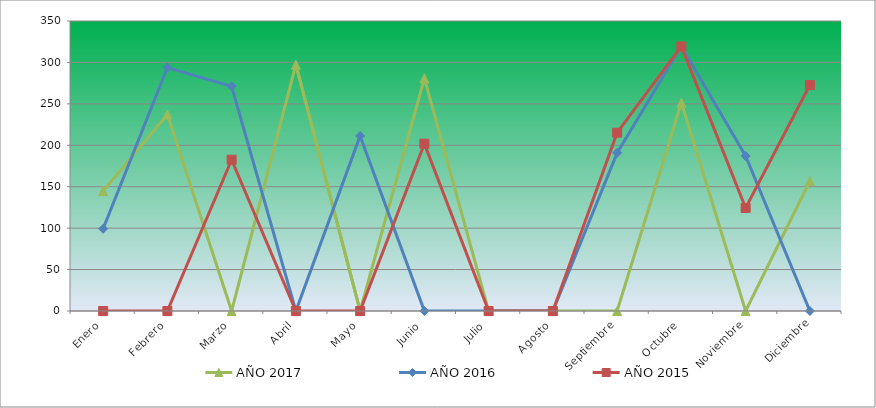
| Category | AÑO 2017 | AÑO 2016 | AÑO 2015 |
|---|---|---|---|
| Enero | 144.855 | 99.209 | 0 |
| Febrero | 237.172 | 293.84 | 0 |
| Marzo | 0 | 271.121 | 182.581 |
| Abril | 297.216 | 0 | 0 |
| Mayo | 0 | 211.292 | 0 |
| Junio | 280.704 | 0 | 202.004 |
| Julio | 0 | 0 | 0 |
| Agosto | 0 | 0 | 0 |
| Septiembre | 0 | 190.845 | 215.212 |
| Octubre | 251.433 | 319.589 | 319.322 |
| Noviembre | 0 | 187.058 | 124.31 |
| Diciembre | 156.864 | 0 | 272.705 |